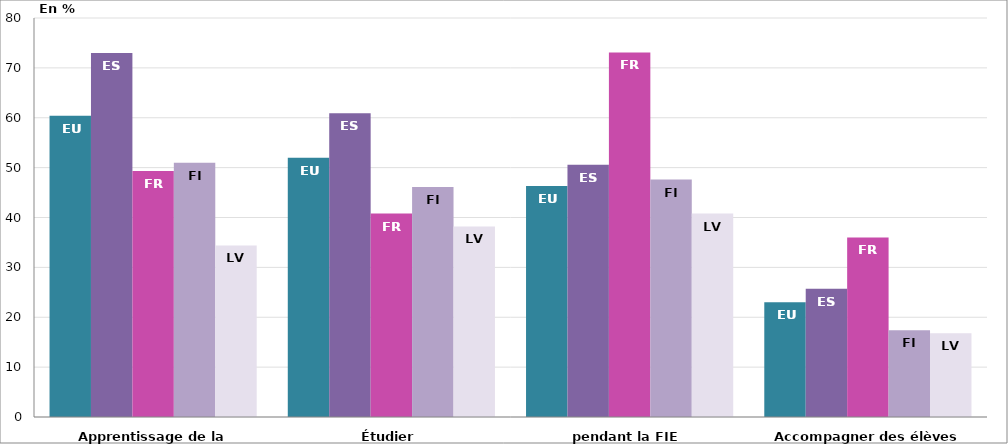
| Category | EU | ES | FR | FI | LV |
|---|---|---|---|---|---|
| 0 | 60.4 | 73 | 49.3 | 51 | 34.4 |
| 1 | 52 | 60.9 | 40.8 | 46.1 | 38.2 |
| 2 | 46.3 | 50.6 | 73.1 | 47.6 | 40.8 |
| 3 | 23 | 25.7 | 36 | 17.4 | 16.8 |